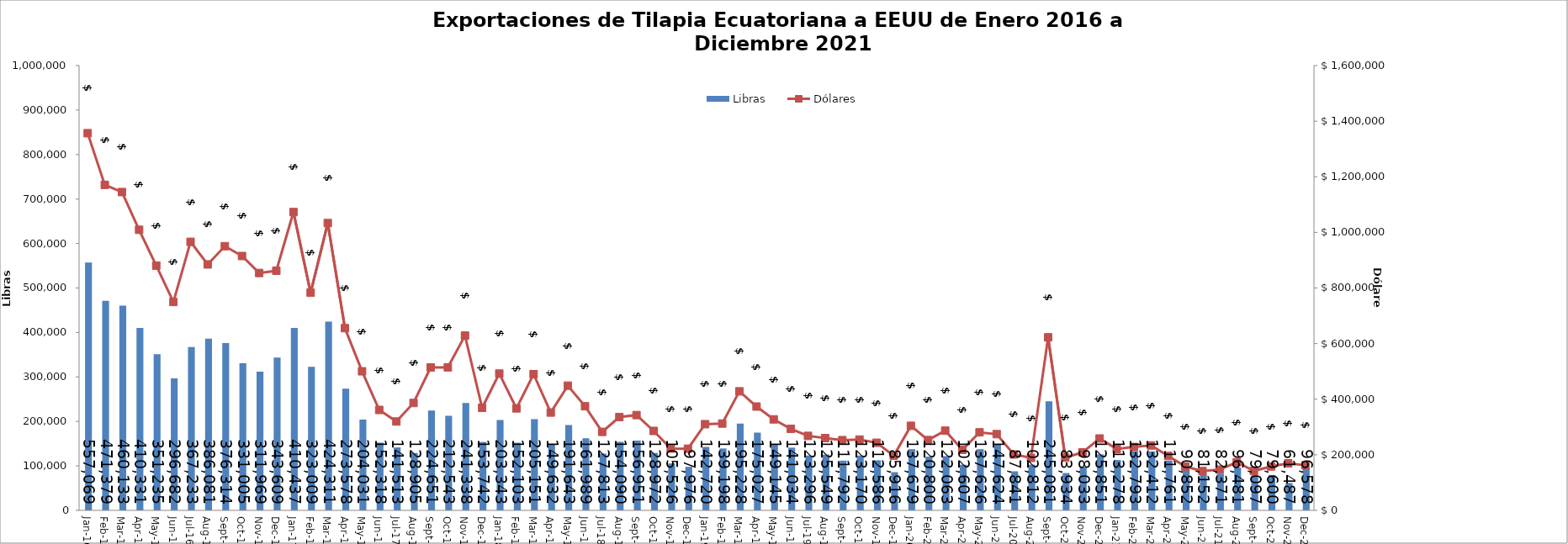
| Category | Libras  |
|---|---|
| 2016-01-01 | 557069.351 |
| 2016-02-01 | 471378.754 |
| 2016-03-01 | 460133.089 |
| 2016-04-01 | 410331.175 |
| 2016-05-01 | 351235 |
| 2016-06-01 | 296682 |
| 2016-07-01 | 367233.45 |
| 2016-08-01 | 386080.575 |
| 2016-09-01 | 376314.197 |
| 2016-10-01 | 331005.258 |
| 2016-11-01 | 311968.537 |
| 2016-12-01 | 343608.956 |
| 2017-01-01 | 410436.996 |
| 2017-02-01 | 323009.174 |
| 2017-03-01 | 424310.544 |
| 2017-04-01 | 273577.632 |
| 2017-05-01 | 204031.321 |
| 2017-06-01 | 152318.019 |
| 2017-07-01 | 141513.274 |
| 2017-08-01 | 128905.167 |
| 2017-09-01 | 224650.945 |
| 2017-10-01 | 212543.281 |
| 2017-11-01 | 241337.562 |
| 2017-12-01 | 153742.19 |
| 2018-01-01 | 203343.126 |
| 2018-02-01 | 152103.348 |
| 2018-03-01 | 205150.914 |
| 2018-04-01 | 149631.969 |
| 2018-05-01 | 191643.207 |
| 2018-06-01 | 161988.864 |
| 2018-07-01 | 127812.844 |
| 2018-08-01 | 154089.71 |
| 2018-09-01 | 156951.307 |
| 2018-10-01 | 128972.475 |
| 2018-11-01 | 105526.341 |
| 2018-12-01 | 97975.517 |
| 2019-01-01 | 142720.485 |
| 2019-02-01 | 139197.502 |
| 2019-03-01 | 195227.919 |
| 2019-04-01 | 175026.986 |
| 2019-05-01 | 149144.748 |
| 2019-06-01 | 141033.951 |
| 2019-07-01 | 123295.578 |
| 2019-08-01 | 125548.7 |
| 2019-09-01 | 111791.871 |
| 2019-10-01 | 123169.915 |
| 2019-11-01 | 112585.534 |
| 2019-12-01 | 85916.246 |
| 2020-01-01 | 137678.519 |
| 2020-02-01 | 120799.948 |
| 2020-03-01 | 122063.196 |
| 2020-04-01 | 102607.424 |
| 2020-05-01 | 137625.608 |
| 2020-06-01 | 147623.56 |
| 2020-07-01 | 87840.879 |
| 2020-08-01 | 102812.454 |
| 2020-09-01 | 245080.992 |
| 2020-10-01 | 83934.293 |
| 2020-11-01 | 98032.838 |
| 2020-12-01 | 125850.733 |
| 2021-01-01 | 113277.785 |
| 2021-02-01 | 132793.081 |
| 2021-03-01 | 132411.682 |
| 2021-04-01 | 111761.006 |
| 2021-05-01 | 90852.39 |
| 2021-06-01 | 81152.062 |
| 2021-07-01 | 82371.217 |
| 2021-08-01 | 96480.785 |
| 2021-09-01 | 79097.356 |
| 2021-10-01 | 79600.01 |
| 2021-11-01 | 61486.852 |
| 2021-12-01 | 96577.788 |